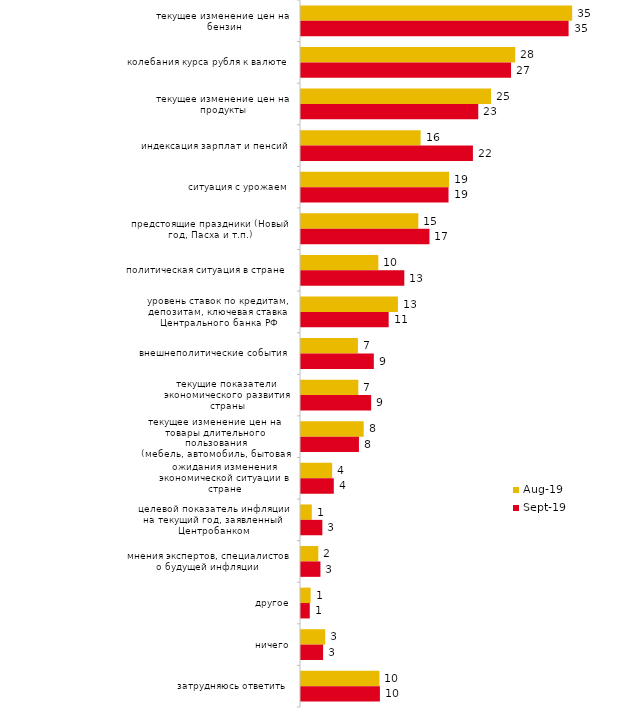
| Category | авг.19 | сен.19 |
|---|---|---|
| текущее изменение цен на бензин | 35.215 | 34.752 |
| колебания курса рубля к валюте | 27.822 | 27.277 |
| текущее изменение цен на продукты | 24.675 | 23.02 |
| индексация зарплат и пенсий | 15.534 | 22.327 |
| ситуация с урожаем | 19.231 | 19.158 |
| предстоящие праздники (Новый год, Пасха и т.п.) | 15.235 | 16.683 |
| политическая ситуация в стране | 10.04 | 13.416 |
| уровень ставок по кредитам, депозитам, ключевая ставка Центрального банка РФ | 12.587 | 11.386 |
| внешнеполитические события | 7.393 | 9.455 |
| текущие показатели экономического развития страны | 7.443 | 9.109 |
| текущее изменение цен на товары длительного пользования (мебель, автомобиль, бытовая техника и т.п.) | 8.142 | 7.525 |
| ожидания изменения экономической ситуации в стране | 4.046 | 4.257 |
| целевой показатель инфляции на текущий год, заявленный Центробанком | 1.399 | 2.772 |
| мнения экспертов, специалистов о будущей инфляции | 2.248 | 2.525 |
| другое | 1.249 | 1.139 |
| ничего | 3.147 | 2.871 |
| затрудняюсь ответить | 10.19 | 10.248 |